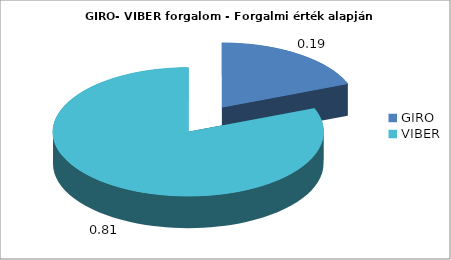
| Category | Series 0 |
|---|---|
| GIRO | 0.19 |
| VIBER | 0.81 |